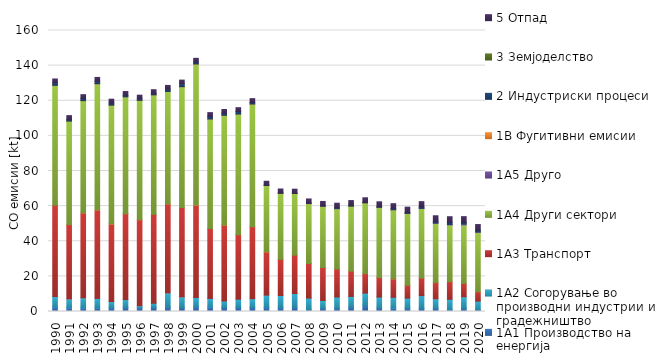
| Category | 1A1 | 1A2 | 1A3 | 1A4 | 1A5 | 1B | 2 | 3 | 5 |
|---|---|---|---|---|---|---|---|---|---|
| 1990.0 | 2.687 | 5.818 | 51.984 | 68.184 | 0 | 0.117 | 1.459 | 0 | 2.147 |
| 1991.0 | 2.12 | 5.046 | 42.323 | 58.881 | 0 | 0.091 | 0.913 | 0 | 2.162 |
| 1992.0 | 2.036 | 5.723 | 48.408 | 63.843 | 0 | 0.054 | 1.229 | 0 | 2.17 |
| 1993.0 | 2.11 | 5.358 | 50.363 | 71.752 | 0 | 0.096 | 1.431 | 0 | 2.17 |
| 1994.0 | 2.151 | 3.508 | 44.199 | 67.674 | 0 | 0.014 | 1.165 | 0 | 2.16 |
| 1995.0 | 2.28 | 4.498 | 48.919 | 66.503 | 0 | 0.011 | 0.89 | 0 | 2.148 |
| 1996.0 | 2.199 | 1.072 | 48.999 | 67.907 | 0 | 0.066 | 0.77 | 0 | 2.154 |
| 1997.0 | 2.274 | 2.43 | 50.598 | 67.99 | 0 | 0.036 | 0.821 | 0 | 2.145 |
| 1998.0 | 2.522 | 8.038 | 50.747 | 63.923 | 0 | 0.071 | 1.284 | 0 | 2.138 |
| 1999.0 | 2.303 | 6.016 | 50.896 | 68.707 | 0 | 0.072 | 1.598 | 0 | 2.149 |
| 2000.0 | 2.56 | 5.403 | 52.724 | 80.192 | 0 | 0.098 | 1.047 | 0 | 2.119 |
| 2001.0 | 2.638 | 4.799 | 39.814 | 62.29 | 0 | 0.096 | 1.439 | 0 | 2.166 |
| 2002.0 | 2.32 | 3.647 | 43.301 | 62.417 | 0 | 0.061 | 1.132 | 0 | 2.15 |
| 2003.0 | 2.269 | 4.741 | 36.783 | 68.596 | 0 | 0.074 | 1.416 | 0 | 2.174 |
| 2004.0 | 2.27 | 5.031 | 41.026 | 69.741 | 0 | 0.093 | 0.844 | 0 | 2.199 |
| 2005.0 | 2.25 | 7.082 | 24.619 | 37.737 | 0 | 0.09 | 0.15 | 0 | 2.223 |
| 2006.0 | 2.195 | 6.913 | 20.589 | 37.567 | 0 | 0.101 | 0.104 | 0 | 2.266 |
| 2007.0 | 2.309 | 7.939 | 21.836 | 35.081 | 0 | 0.1 | 0.057 | 0 | 2.318 |
| 2008.0 | 1.045 | 6.613 | 19.678 | 34.033 | 0 | 0.101 | 0.241 | 0 | 2.378 |
| 2009.0 | 1.828 | 4.423 | 18.795 | 34.807 | 0 | 0.092 | 0.27 | 0 | 2.455 |
| 2010.0 | 1.775 | 6.459 | 15.929 | 34.306 | 0 | 0.081 | 0.574 | 0 | 2.526 |
| 2011.0 | 2.532 | 6.026 | 14.416 | 36.949 | 0 | 0.067 | 0.559 | 0 | 2.622 |
| 2012.0 | 3.363 | 7.111 | 11.111 | 40.258 | 0 | 0.025 | 0.174 | 0 | 2.712 |
| 2013.0 | 1.985 | 6.229 | 11.125 | 39.961 | 0 | 0.006 | 0.351 | 0 | 2.801 |
| 2014.0 | 2.035 | 6.052 | 10.507 | 39.285 | 0 | 0.001 | 0.613 | 0 | 2.902 |
| 2015.0 | 1.908 | 5.71 | 7.242 | 41.001 | 0.034 | 0 | 0.498 | 0 | 2.995 |
| 2016.0 | 1.684 | 7.351 | 9.987 | 39.59 | 0.209 | 0 | 0.648 | 0 | 3.088 |
| 2017.0 | 1.763 | 5.438 | 9.252 | 33.687 | 0.396 | 0 | 0.806 | 0 | 3.172 |
| 2018.0 | 1.03 | 5.916 | 10.086 | 32.233 | 0.349 | 0 | 1.098 | 0 | 3.257 |
| 2019.0 | 1.803 | 6.545 | 7.637 | 33.284 | 0.559 | 0 | 0.845 | 0 | 3.338 |
| 2020.0 | 1.095 | 4.784 | 5.426 | 33.724 | 0.378 | 0 | 0.693 | 0 | 3.414 |